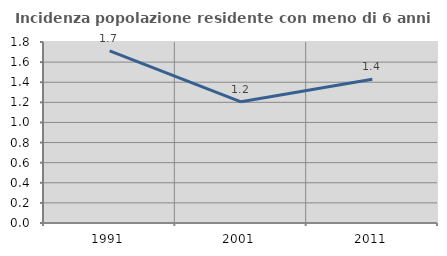
| Category | Incidenza popolazione residente con meno di 6 anni |
|---|---|
| 1991.0 | 1.712 |
| 2001.0 | 1.205 |
| 2011.0 | 1.429 |